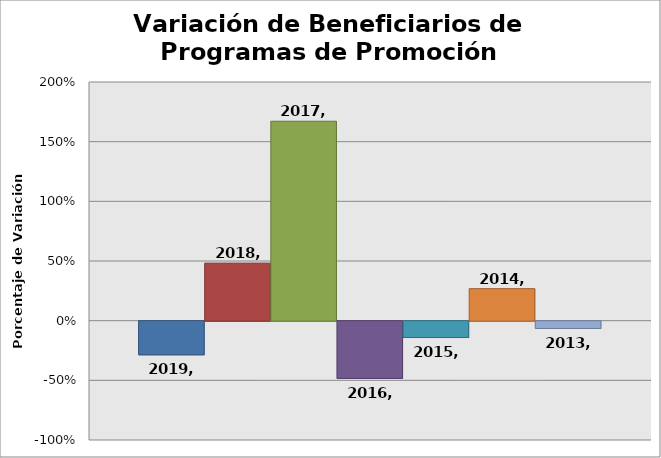
| Category | 2019 | 2018 | 2017 | 2016 | 2015 | 2014 | 2013 |
|---|---|---|---|---|---|---|---|
| 0 | -0.282 | 0.482 | 1.671 | -0.48 | -0.137 | 0.268 | -0.061 |